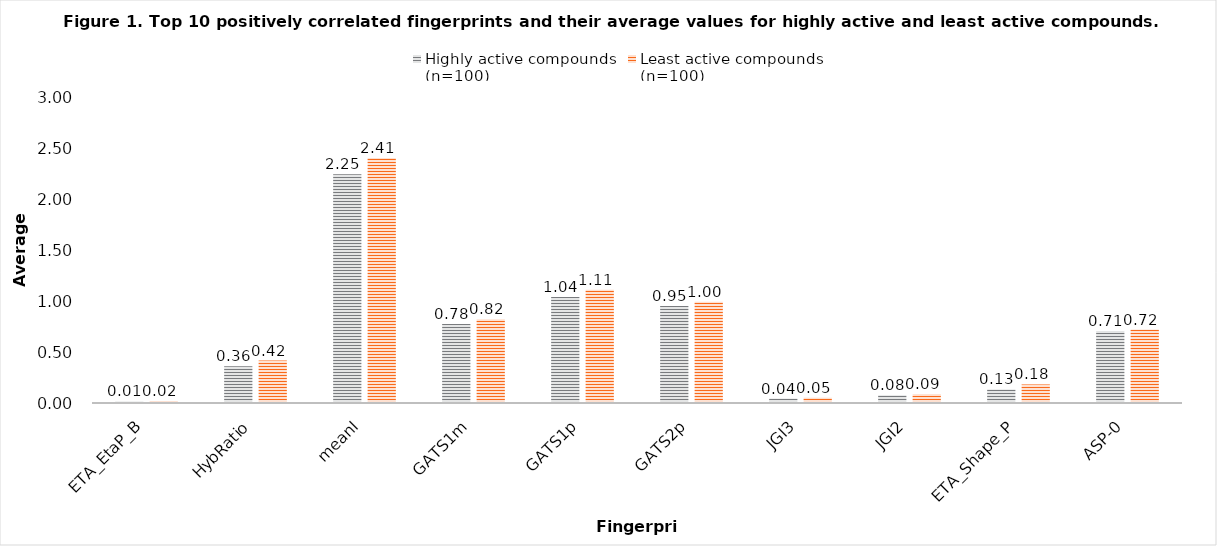
| Category | Highly active compounds 
(n=100) | Least active compounds 
(n=100) |
|---|---|---|
| ETA_EtaP_B | 0.015 | 0.019 |
| HybRatio | 0.362 | 0.418 |
| meanI | 2.25 | 2.409 |
| GATS1m | 0.776 | 0.824 |
| GATS1p | 1.044 | 1.115 |
| GATS2p | 0.954 | 0.997 |
| JGI3 | 0.044 | 0.052 |
| JGI2 | 0.077 | 0.087 |
| ETA_Shape_P | 0.134 | 0.183 |
| ASP-0 | 0.708 | 0.722 |